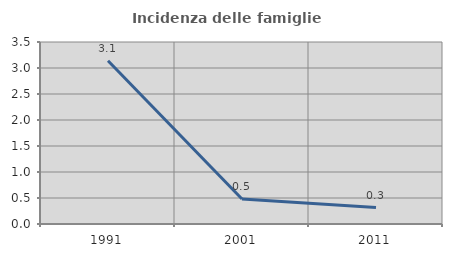
| Category | Incidenza delle famiglie numerose |
|---|---|
| 1991.0 | 3.14 |
| 2001.0 | 0.482 |
| 2011.0 | 0.316 |